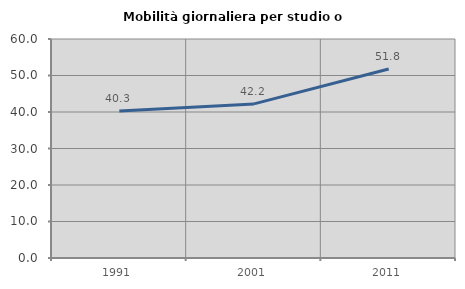
| Category | Mobilità giornaliera per studio o lavoro |
|---|---|
| 1991.0 | 40.274 |
| 2001.0 | 42.22 |
| 2011.0 | 51.79 |